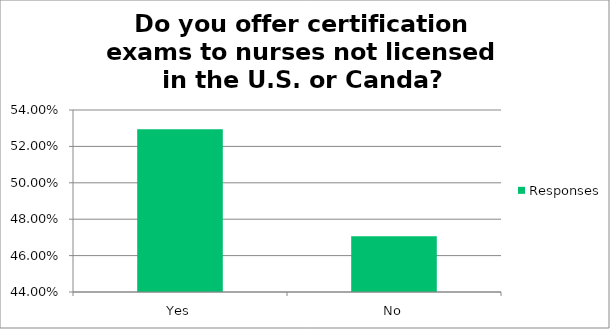
| Category | Responses |
|---|---|
| Yes | 0.529 |
| No | 0.471 |